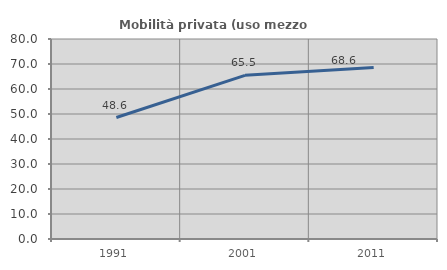
| Category | Mobilità privata (uso mezzo privato) |
|---|---|
| 1991.0 | 48.586 |
| 2001.0 | 65.475 |
| 2011.0 | 68.644 |